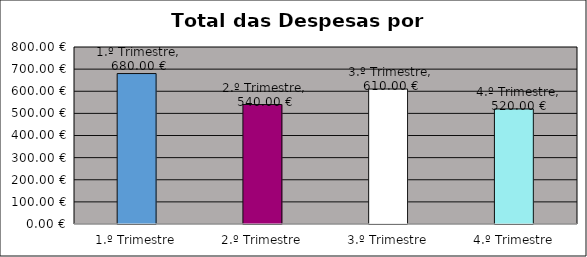
| Category | Series 0 |
|---|---|
| 1.º Trimestre | 680 |
| 2.º Trimestre | 540 |
| 3.º Trimestre | 610 |
| 4.º Trimestre | 520 |